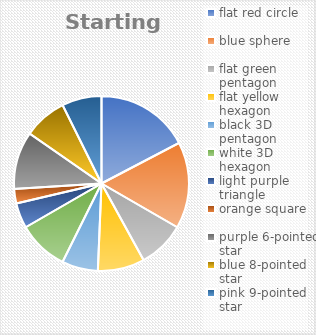
| Category | Series 1 | Series 0 |
|---|---|---|
| flat red circle | 26 | 26 |
| blue sphere | 24 | 24 |
| flat green pentagon | 13 | 13 |
| flat yellow hexagon | 13 | 13 |
| black 3D pentagon | 10 | 10 |
| white 3D hexagon | 14 | 14 |
| light purple triangle | 7 | 7 |
| orange square | 4 | 4 |
| purple 6-pointed star | 16 | 16 |
| blue 8-pointed star | 12 | 12 |
| pink 9-pointed star | 11 | 11 |